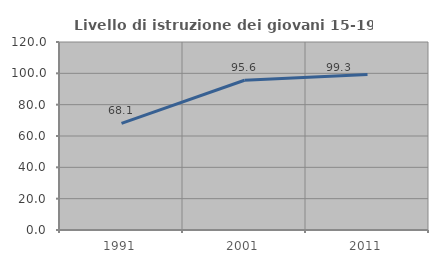
| Category | Livello di istruzione dei giovani 15-19 anni |
|---|---|
| 1991.0 | 68.11 |
| 2001.0 | 95.597 |
| 2011.0 | 99.333 |